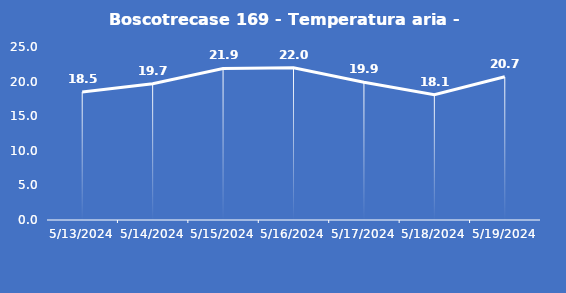
| Category | Boscotrecase 169 - Temperatura aria - Grezzo (°C) |
|---|---|
| 5/13/24 | 18.5 |
| 5/14/24 | 19.7 |
| 5/15/24 | 21.9 |
| 5/16/24 | 22 |
| 5/17/24 | 19.9 |
| 5/18/24 | 18.1 |
| 5/19/24 | 20.7 |